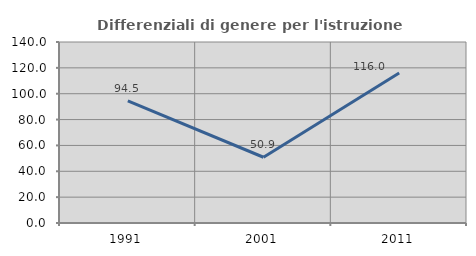
| Category | Differenziali di genere per l'istruzione superiore |
|---|---|
| 1991.0 | 94.5 |
| 2001.0 | 50.852 |
| 2011.0 | 115.964 |